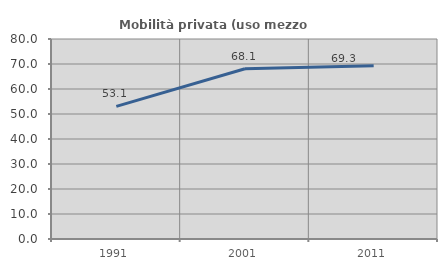
| Category | Mobilità privata (uso mezzo privato) |
|---|---|
| 1991.0 | 53.071 |
| 2001.0 | 68.089 |
| 2011.0 | 69.309 |